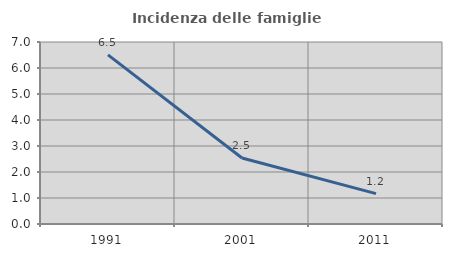
| Category | Incidenza delle famiglie numerose |
|---|---|
| 1991.0 | 6.506 |
| 2001.0 | 2.539 |
| 2011.0 | 1.167 |